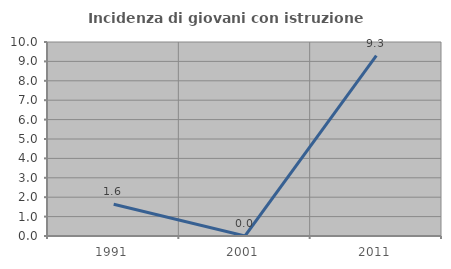
| Category | Incidenza di giovani con istruzione universitaria |
|---|---|
| 1991.0 | 1.639 |
| 2001.0 | 0 |
| 2011.0 | 9.302 |